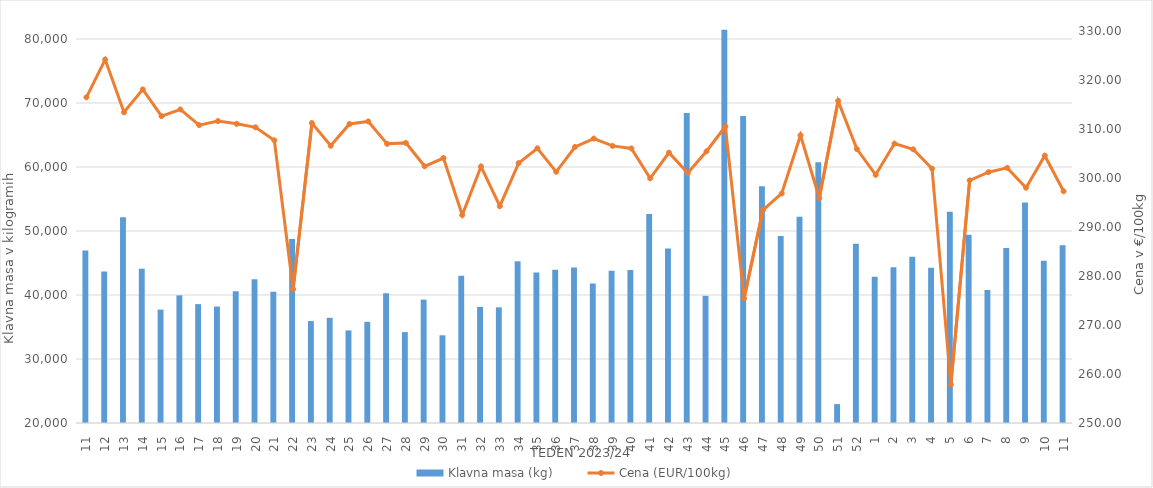
| Category | Klavna masa (kg) |
|---|---|
| 11.0 | 46952 |
| 12.0 | 43683 |
| 13.0 | 52135 |
| 14.0 | 44103 |
| 15.0 | 37719 |
| 16.0 | 39943 |
| 17.0 | 38574 |
| 18.0 | 38200 |
| 19.0 | 40581 |
| 20.0 | 42443 |
| 21.0 | 40517 |
| 22.0 | 48742 |
| 23.0 | 35927 |
| 24.0 | 36436 |
| 25.0 | 34463 |
| 26.0 | 35812 |
| 27.0 | 40280 |
| 28.0 | 34201 |
| 29.0 | 39279 |
| 30.0 | 33702 |
| 31.0 | 43020 |
| 32.0 | 38146 |
| 33.0 | 38070 |
| 34.0 | 45290 |
| 35.0 | 43513 |
| 36.0 | 43945 |
| 37.0 | 44302 |
| 38.0 | 41798 |
| 39.0 | 43790 |
| 40.0 | 43913 |
| 41.0 | 52663 |
| 42.0 | 47275 |
| 43.0 | 68419 |
| 44.0 | 39872 |
| 45.0 | 81439 |
| 46.0 | 67983 |
| 47.0 | 57006 |
| 48.0 | 49204 |
| 49.0 | 52219 |
| 50.0 | 60759 |
| 51.0 | 22954 |
| 52.0 | 48002 |
| 1.0 | 42866 |
| 2.0 | 44318 |
| 3.0 | 45969 |
| 4.0 | 44266 |
| 5.0 | 52991 |
| 6.0 | 49406 |
| 7.0 | 40769 |
| 8.0 | 47349 |
| 9.0 | 54448 |
| 10.0 | 45343 |
| 11.0 | 47770 |